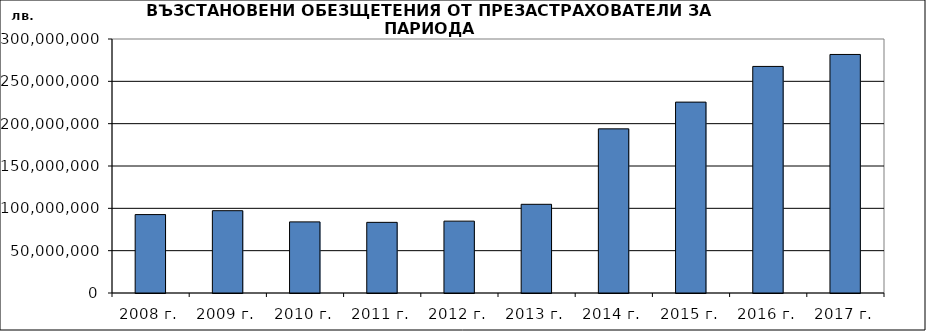
| Category | Series 0 |
|---|---|
| 2008 г. | 92618851.945 |
| 2009 г. | 97201488.723 |
| 2010 г. | 83991914.008 |
| 2011 г. | 83436121.79 |
| 2012 г. | 84879991.412 |
| 2013 г. | 104754870.79 |
| 2014 г. | 193869580.188 |
| 2015 г. | 225460313.7 |
| 2016 г. | 267607430.706 |
| 2017 г. | 281740406.295 |